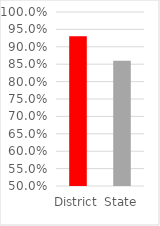
| Category | Series 0 |
|---|---|
| District | 0.93 |
| State | 0.86 |